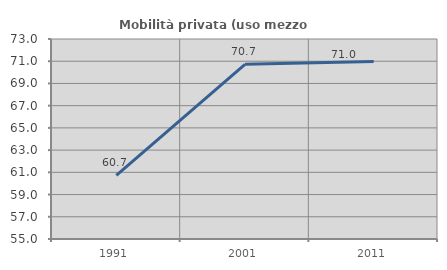
| Category | Mobilità privata (uso mezzo privato) |
|---|---|
| 1991.0 | 60.735 |
| 2001.0 | 70.72 |
| 2011.0 | 70.965 |